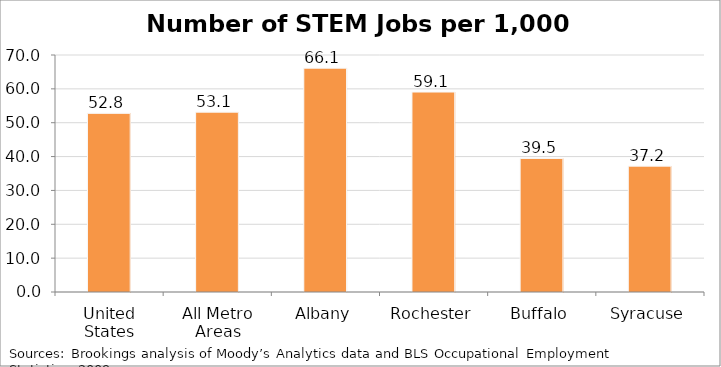
| Category | Number of STEM jobs per 1,000 jobs |
|---|---|
| United States | 52.772 |
| All Metro Areas | 53.114 |
| Albany | 66.108 |
| Rochester | 59.065 |
| Buffalo | 39.453 |
| Syracuse | 37.176 |